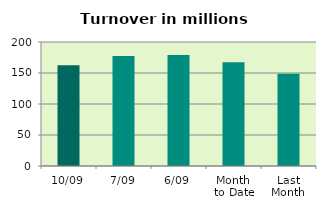
| Category | Series 0 |
|---|---|
| 10/09 | 162.409 |
| 7/09 | 177.306 |
| 6/09 | 178.881 |
| Month 
to Date | 167.5 |
| Last
Month | 148.736 |